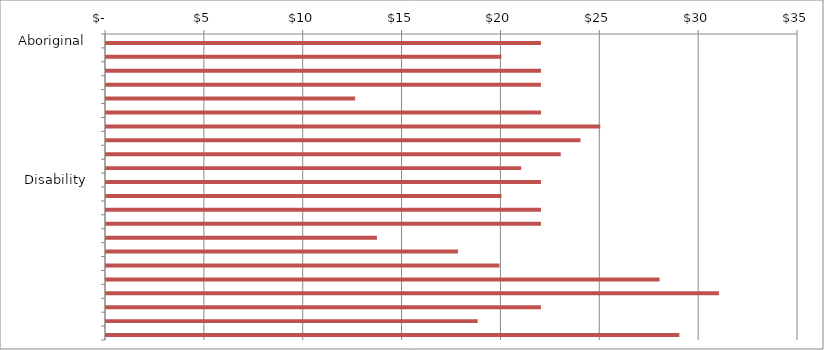
| Category | Series 0 | Series 1 |
|---|---|---|
|  Aboriginal  | 0 | 22 |
|    | 0 | 20 |
|    | 0 | 22 |
|  Age Group  | 0 | 22 |
|    | 0 | 12.6 |
|    | 0 | 22 |
|    | 0 | 25 |
|    | 0 | 24 |
|    | 0 | 23 |
|    | 0 | 21 |
|  Disability  | 0 | 22 |
|    | 0 | 20 |
|    | 0 | 22 |
|  Education  | 0 | 22 |
|    | 0 | 13.7 |
|    | 0 | 17.8 |
|    | 0 | 19.9 |
|    | 0 | 28 |
|    | 0 | 31 |
|  Sector  | 0 | 22 |
|    | 0 | 18.8 |
|    | 0 | 29 |